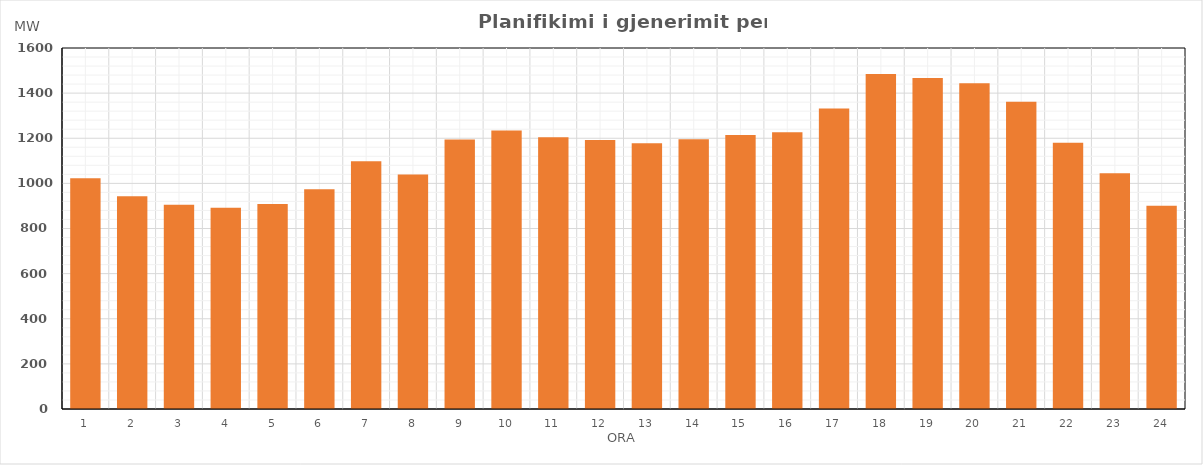
| Category | Max (MW) |
|---|---|
| 0 | 1022.33 |
| 1 | 943.03 |
| 2 | 905.41 |
| 3 | 891.7 |
| 4 | 908.6 |
| 5 | 974.3 |
| 6 | 1097.8 |
| 7 | 1038.88 |
| 8 | 1194.75 |
| 9 | 1234.18 |
| 10 | 1204.97 |
| 11 | 1192.36 |
| 12 | 1177.96 |
| 13 | 1195.27 |
| 14 | 1214.33 |
| 15 | 1226.56 |
| 16 | 1331.62 |
| 17 | 1484.52 |
| 18 | 1466.72 |
| 19 | 1443.45 |
| 20 | 1362.21 |
| 21 | 1180.32 |
| 22 | 1045.02 |
| 23 | 901.29 |